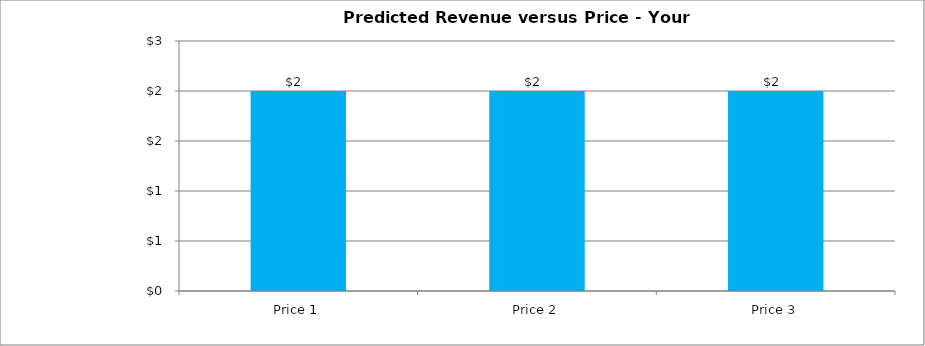
| Category | Your Predicted Revenue |
|---|---|
| Price 1 | 2 |
| Price 2 | 2 |
| Price 3 | 2 |